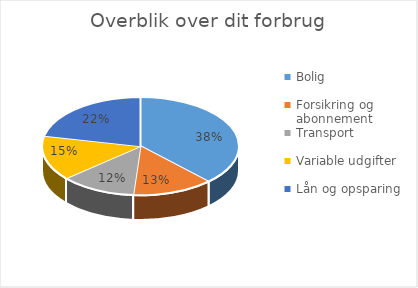
| Category | Series 0 |
|---|---|
| Bolig | 5283.333 |
| Forsikring og abonnement | 1853.333 |
| Transport | 1737.5 |
| Variable udgifter | 2058.333 |
| Lån og opsparing | 3010.583 |